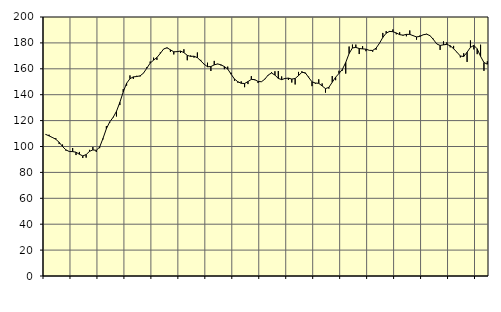
| Category | Piggar | Series 1 |
|---|---|---|
| nan | 109.1 | 109.36 |
| 87.0 | 109.1 | 108.2 |
| 87.0 | 106.6 | 106.95 |
| 87.0 | 106.4 | 105.59 |
| nan | 101.9 | 103.23 |
| 88.0 | 101.5 | 100 |
| 88.0 | 96.8 | 97.39 |
| 88.0 | 96 | 96.13 |
| nan | 98.8 | 96.05 |
| 89.0 | 93.4 | 95.6 |
| 89.0 | 95.8 | 94 |
| 89.0 | 91.1 | 92.74 |
| nan | 91.4 | 93.73 |
| 90.0 | 97.4 | 96.26 |
| 90.0 | 99.6 | 97.35 |
| 90.0 | 95.8 | 97.05 |
| nan | 98.7 | 99.54 |
| 91.0 | 105.5 | 106.22 |
| 91.0 | 115.7 | 113.7 |
| 91.0 | 118.4 | 119.02 |
| nan | 122.8 | 122.49 |
| 92.0 | 123.2 | 127.15 |
| 92.0 | 132 | 134.08 |
| 92.0 | 144.3 | 142.15 |
| nan | 147 | 148.83 |
| 93.0 | 154.9 | 152.35 |
| 93.0 | 152.2 | 153.77 |
| 93.0 | 154.6 | 154.04 |
| nan | 154.1 | 154.56 |
| 94.0 | 156.5 | 156.63 |
| 94.0 | 161.2 | 160.48 |
| 94.0 | 165.6 | 164.4 |
| nan | 168.6 | 166.68 |
| 95.0 | 166.9 | 168.72 |
| 95.0 | 172.6 | 171.88 |
| 95.0 | 175.2 | 175.32 |
| nan | 175.9 | 176.26 |
| 96.0 | 173.1 | 174.65 |
| 96.0 | 171.1 | 173.14 |
| 96.0 | 173.6 | 173.24 |
| nan | 172.2 | 173.7 |
| 97.0 | 175.1 | 172.51 |
| 97.0 | 166.6 | 170.37 |
| 97.0 | 170.3 | 169.58 |
| nan | 168.6 | 169.73 |
| 98.0 | 172.6 | 168.59 |
| 98.0 | 166.9 | 166.14 |
| 98.0 | 163.7 | 163.56 |
| nan | 164.7 | 161.59 |
| 99.0 | 158.3 | 161.73 |
| 99.0 | 166.1 | 163.03 |
| 99.0 | 163.6 | 163.77 |
| nan | 162.6 | 163.07 |
| 0.0 | 159.7 | 161.71 |
| 0.0 | 161.7 | 159.82 |
| 0.0 | 157 | 155.83 |
| nan | 150.8 | 152.11 |
| 1.0 | 149.3 | 150.02 |
| 1.0 | 150.3 | 148.8 |
| 1.0 | 145.8 | 148.66 |
| nan | 148.2 | 150.12 |
| 2.0 | 154.3 | 151.82 |
| 2.0 | 151.2 | 151.65 |
| 2.0 | 149 | 150.24 |
| nan | 150.1 | 150.01 |
| 3.0 | 152.2 | 151.98 |
| 3.0 | 155 | 155.21 |
| 3.0 | 157.4 | 156.74 |
| nan | 158.1 | 155.14 |
| 4.0 | 158.3 | 152.58 |
| 4.0 | 154.1 | 151.64 |
| 4.0 | 152.8 | 152.55 |
| nan | 151.4 | 152.81 |
| 5.0 | 149.4 | 152.07 |
| 5.0 | 147.9 | 152.5 |
| 5.0 | 157.6 | 154.77 |
| nan | 158.1 | 157.28 |
| 6.0 | 156.2 | 156.93 |
| 6.0 | 153.9 | 153.37 |
| 6.0 | 146.6 | 149.91 |
| nan | 148.5 | 149.02 |
| 7.0 | 151.9 | 148.78 |
| 7.0 | 148.7 | 146.77 |
| 7.0 | 141.6 | 144.7 |
| nan | 144.7 | 145.69 |
| 8.0 | 154.4 | 149.66 |
| 8.0 | 151.2 | 153.49 |
| 8.0 | 158.5 | 156.39 |
| nan | 158.6 | 159.51 |
| 9.0 | 156.3 | 164.88 |
| 9.0 | 177.2 | 171.81 |
| 9.0 | 178.7 | 176.12 |
| nan | 178.7 | 176.51 |
| 10.0 | 171.4 | 175.66 |
| 10.0 | 177.5 | 175.38 |
| 10.0 | 173.6 | 175.16 |
| nan | 174.2 | 174.24 |
| 11.0 | 173.2 | 174.18 |
| 11.0 | 174.7 | 175.94 |
| 11.0 | 179.5 | 179.66 |
| nan | 187.7 | 184.21 |
| 12.0 | 189.1 | 187.51 |
| 12.0 | 188.4 | 188.88 |
| 12.0 | 190.4 | 188.64 |
| nan | 186.6 | 187.69 |
| 13.0 | 188.2 | 186.37 |
| 13.0 | 185.6 | 185.97 |
| 13.0 | 185.1 | 186.58 |
| nan | 189.6 | 186.59 |
| 14.0 | 185.8 | 185.57 |
| 14.0 | 182.5 | 184.62 |
| 14.0 | 185.7 | 185.03 |
| nan | 186.1 | 186.28 |
| 15.0 | 187 | 186.74 |
| 15.0 | 185.4 | 185.59 |
| 15.0 | 183.2 | 182.64 |
| nan | 179.4 | 179.19 |
| 16.0 | 174.6 | 178.02 |
| 16.0 | 181.2 | 178.52 |
| 16.0 | 180.5 | 178.87 |
| nan | 176.6 | 177.79 |
| 17.0 | 177.7 | 175.52 |
| 17.0 | 172.6 | 172.79 |
| 17.0 | 168.8 | 169.88 |
| nan | 172 | 169.48 |
| 18.0 | 165.3 | 172.8 |
| 18.0 | 181.9 | 176.55 |
| 18.0 | 175 | 178.08 |
| nan | 171.3 | 175.41 |
| 19.0 | 178.6 | 169.6 |
| 19.0 | 158.4 | 164.86 |
| 19.0 | 165.8 | 163.57 |